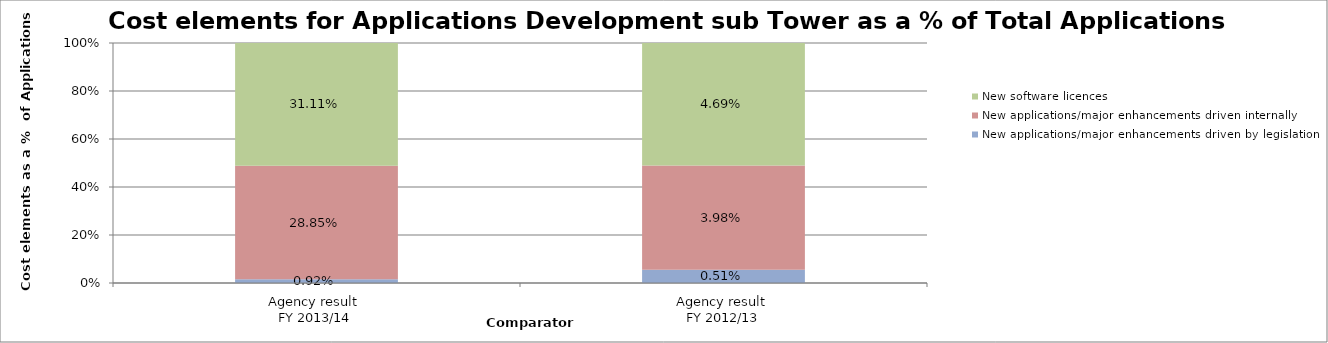
| Category | New applications/major enhancements driven by legislation | New applications/major enhancements driven internally | New software licences |
|---|---|---|---|
| Agency result 
FY 2013/14 | 0.009 | 0.288 | 0.311 |
| Agency result 
FY 2012/13 | 0.005 | 0.04 | 0.047 |